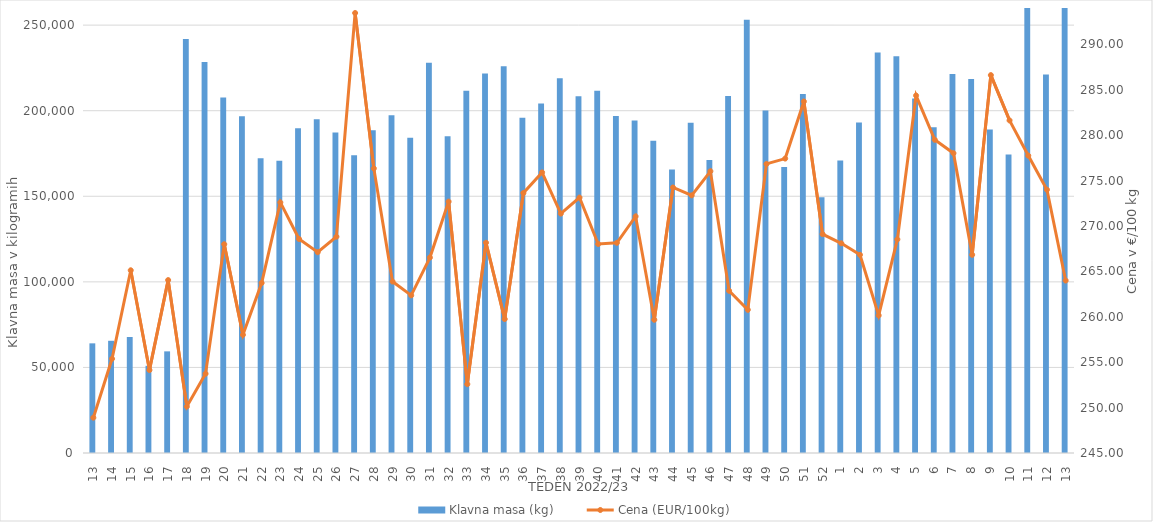
| Category | Klavna masa (kg) |
|---|---|
| 13.0 | 64069 |
| 14.0 | 65564 |
| 15.0 | 67787 |
| 16.0 | 50958 |
| 17.0 | 59387 |
| 18.0 | 241833 |
| 19.0 | 228389 |
| 20.0 | 207661 |
| 21.0 | 196732 |
| 22.0 | 172190 |
| 23.0 | 170751 |
| 24.0 | 189775 |
| 25.0 | 195029 |
| 26.0 | 187239 |
| 27.0 | 173967 |
| 28.0 | 188601 |
| 29.0 | 197293 |
| 30.0 | 184259 |
| 31.0 | 228023 |
| 32.0 | 185079 |
| 33.0 | 211612 |
| 34.0 | 221748 |
| 35.0 | 225927 |
| 36.0 | 195924 |
| 37.0 | 204224 |
| 38.0 | 218966 |
| 39.0 | 208403 |
| 40.0 | 211635 |
| 41.0 | 196841 |
| 42.0 | 194271 |
| 43.0 | 182399 |
| 44.0 | 165696 |
| 45.0 | 193022 |
| 46.0 | 171172 |
| 47.0 | 208597 |
| 48.0 | 253151 |
| 49.0 | 200117 |
| 50.0 | 167119 |
| 51.0 | 209797 |
| 52.0 | 149439 |
| 1.0 | 170843 |
| 2.0 | 193093 |
| 3.0 | 234042 |
| 4.0 | 231737 |
| 5.0 | 207136 |
| 6.0 | 190311 |
| 7.0 | 221366 |
| 8.0 | 218470 |
| 9.0 | 189006 |
| 10.0 | 174425 |
| 11.0 | 265476 |
| 12.0 | 221171 |
| 13.0 | 262102 |